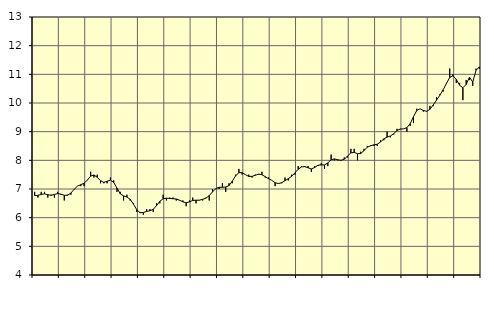
| Category | Piggar | Offentlig förvaltning m.m., SNI 84, 99 |
|---|---|---|
| nan | 6.9 | 6.77 |
| 87.0 | 6.7 | 6.78 |
| 87.0 | 6.9 | 6.81 |
| 87.0 | 6.9 | 6.83 |
| nan | 6.7 | 6.8 |
| 88.0 | 6.8 | 6.78 |
| 88.0 | 6.7 | 6.81 |
| 88.0 | 6.9 | 6.84 |
| nan | 6.8 | 6.82 |
| 89.0 | 6.6 | 6.78 |
| 89.0 | 6.8 | 6.78 |
| 89.0 | 6.8 | 6.86 |
| nan | 7 | 6.99 |
| 90.0 | 7.1 | 7.1 |
| 90.0 | 7.1 | 7.15 |
| 90.0 | 7.1 | 7.2 |
| nan | 7.3 | 7.31 |
| 91.0 | 7.6 | 7.45 |
| 91.0 | 7.4 | 7.49 |
| 91.0 | 7.5 | 7.41 |
| nan | 7.2 | 7.29 |
| 92.0 | 7.2 | 7.23 |
| 92.0 | 7.2 | 7.27 |
| 92.0 | 7.4 | 7.31 |
| nan | 7.3 | 7.23 |
| 93.0 | 6.9 | 7.03 |
| 93.0 | 6.9 | 6.83 |
| 93.0 | 6.6 | 6.76 |
| nan | 6.8 | 6.72 |
| 94.0 | 6.6 | 6.64 |
| 94.0 | 6.5 | 6.47 |
| 94.0 | 6.2 | 6.28 |
| nan | 6.2 | 6.17 |
| 95.0 | 6.1 | 6.18 |
| 95.0 | 6.3 | 6.22 |
| 95.0 | 6.3 | 6.24 |
| nan | 6.2 | 6.29 |
| 96.0 | 6.5 | 6.42 |
| 96.0 | 6.5 | 6.57 |
| 96.0 | 6.8 | 6.66 |
| nan | 6.6 | 6.68 |
| 97.0 | 6.7 | 6.67 |
| 97.0 | 6.7 | 6.66 |
| 97.0 | 6.6 | 6.65 |
| nan | 6.6 | 6.61 |
| 98.0 | 6.6 | 6.55 |
| 98.0 | 6.4 | 6.52 |
| 98.0 | 6.6 | 6.55 |
| nan | 6.7 | 6.6 |
| 99.0 | 6.5 | 6.61 |
| 99.0 | 6.6 | 6.61 |
| 99.0 | 6.6 | 6.64 |
| nan | 6.7 | 6.68 |
| 0.0 | 6.6 | 6.77 |
| 0.0 | 7 | 6.9 |
| 0.0 | 7 | 7.01 |
| nan | 7 | 7.06 |
| 1.0 | 7.2 | 7.06 |
| 1.0 | 6.9 | 7.07 |
| 1.0 | 7.2 | 7.12 |
| nan | 7.2 | 7.27 |
| 2.0 | 7.5 | 7.46 |
| 2.0 | 7.7 | 7.57 |
| 2.0 | 7.5 | 7.57 |
| nan | 7.5 | 7.5 |
| 3.0 | 7.5 | 7.44 |
| 3.0 | 7.4 | 7.44 |
| 3.0 | 7.5 | 7.48 |
| nan | 7.5 | 7.52 |
| 4.0 | 7.6 | 7.5 |
| 4.0 | 7.4 | 7.43 |
| 4.0 | 7.4 | 7.36 |
| nan | 7.3 | 7.3 |
| 5.0 | 7.1 | 7.22 |
| 5.0 | 7.2 | 7.19 |
| 5.0 | 7.2 | 7.22 |
| nan | 7.4 | 7.29 |
| 6.0 | 7.3 | 7.36 |
| 6.0 | 7.5 | 7.44 |
| 6.0 | 7.5 | 7.56 |
| nan | 7.8 | 7.69 |
| 7.0 | 7.8 | 7.77 |
| 7.0 | 7.8 | 7.78 |
| 7.0 | 7.8 | 7.74 |
| nan | 7.6 | 7.7 |
| 8.0 | 7.8 | 7.75 |
| 8.0 | 7.8 | 7.83 |
| 8.0 | 7.9 | 7.84 |
| nan | 7.7 | 7.84 |
| 9.0 | 7.8 | 7.91 |
| 9.0 | 8.2 | 8.02 |
| 9.0 | 8 | 8.05 |
| nan | 8 | 8.02 |
| 10.0 | 8 | 8 |
| 10.0 | 8.1 | 8.04 |
| 10.0 | 8.1 | 8.15 |
| nan | 8.4 | 8.26 |
| 11.0 | 8.4 | 8.28 |
| 11.0 | 8 | 8.23 |
| 11.0 | 8.3 | 8.24 |
| nan | 8.4 | 8.34 |
| 12.0 | 8.5 | 8.46 |
| 12.0 | 8.5 | 8.51 |
| 12.0 | 8.5 | 8.54 |
| nan | 8.5 | 8.56 |
| 13.0 | 8.7 | 8.64 |
| 13.0 | 8.7 | 8.75 |
| 13.0 | 9 | 8.81 |
| nan | 8.8 | 8.85 |
| 14.0 | 8.9 | 8.93 |
| 14.0 | 9.1 | 9.04 |
| 14.0 | 9.1 | 9.09 |
| nan | 9.1 | 9.1 |
| 15.0 | 9 | 9.14 |
| 15.0 | 9.2 | 9.28 |
| 15.0 | 9.3 | 9.52 |
| nan | 9.8 | 9.74 |
| 16.0 | 9.8 | 9.8 |
| 16.0 | 9.7 | 9.74 |
| 16.0 | 9.7 | 9.71 |
| nan | 9.9 | 9.78 |
| 17.0 | 9.9 | 9.93 |
| 17.0 | 10.2 | 10.1 |
| 17.0 | 10.3 | 10.27 |
| nan | 10.4 | 10.46 |
| 18.0 | 10.7 | 10.68 |
| 18.0 | 11.2 | 10.89 |
| 18.0 | 11 | 10.95 |
| nan | 10.7 | 10.82 |
| 19.0 | 10.7 | 10.62 |
| 19.0 | 10.1 | 10.53 |
| 19.0 | 10.8 | 10.65 |
| nan | 10.8 | 10.9 |
| 20.0 | 10.6 | 10.73 |
| 20.0 | 11.2 | 11.14 |
| 20.0 | 11.2 | 11.26 |